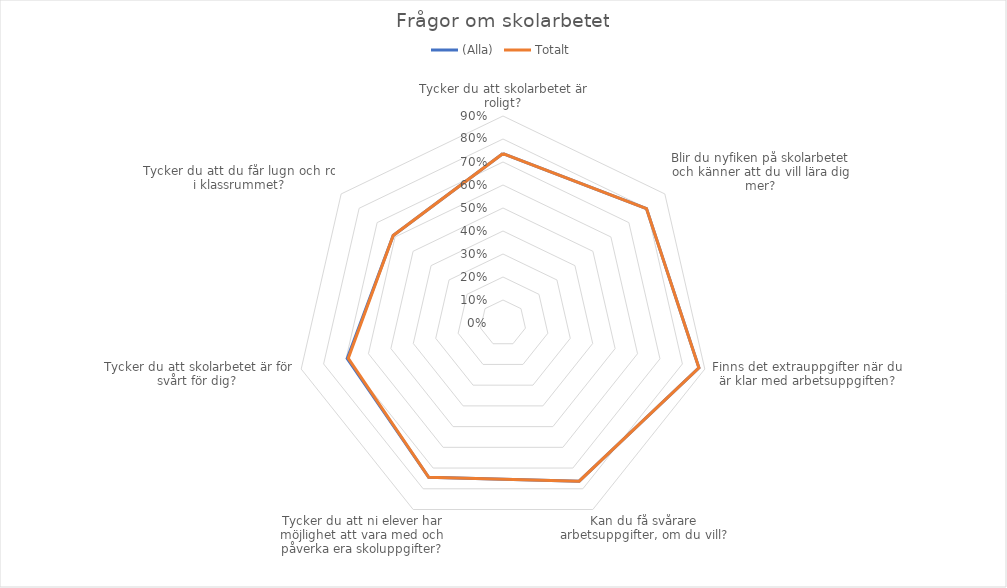
| Category | (Alla) | Totalt |
|---|---|---|
| Tycker du att skolarbetet är roligt? | 0.737 | 0.737 |
| Blir du nyfiken på skolarbetet och känner att du vill lära dig mer? | 0.798 | 0.798 |
| Finns det extrauppgifter när du är klar med arbetsuppgiften? | 0.874 | 0.874 |
| Kan du få svårare arbetsuppgifter, om du vill? | 0.763 | 0.763 |
| Tycker du att ni elever har möjlighet att vara med och påverka era skoluppgifter? | 0.745 | 0.745 |
| Tycker du att skolarbetet är för svårt för dig?  | 0.695 | 0.69 |
| Tycker du att du får lugn och ro i klassrummet? | 0.611 | 0.611 |